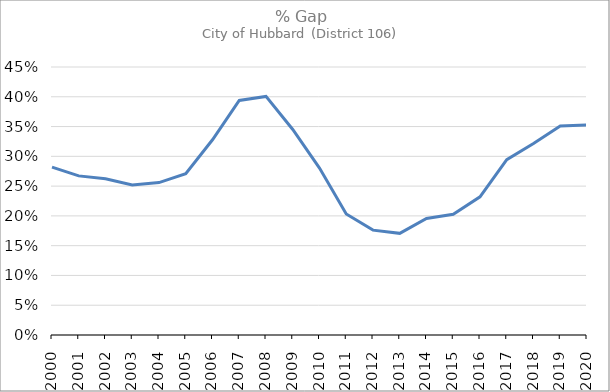
| Category | Series 0 |
|---|---|
| 2000.0 | 0.282 |
| 2001.0 | 0.267 |
| 2002.0 | 0.262 |
| 2003.0 | 0.252 |
| 2004.0 | 0.256 |
| 2005.0 | 0.271 |
| 2006.0 | 0.328 |
| 2007.0 | 0.394 |
| 2008.0 | 0.401 |
| 2009.0 | 0.345 |
| 2010.0 | 0.28 |
| 2011.0 | 0.203 |
| 2012.0 | 0.176 |
| 2013.0 | 0.171 |
| 2014.0 | 0.196 |
| 2015.0 | 0.203 |
| 2016.0 | 0.232 |
| 2017.0 | 0.294 |
| 2018.0 | 0.322 |
| 2019.0 | 0.351 |
| 2020.0 | 0.353 |